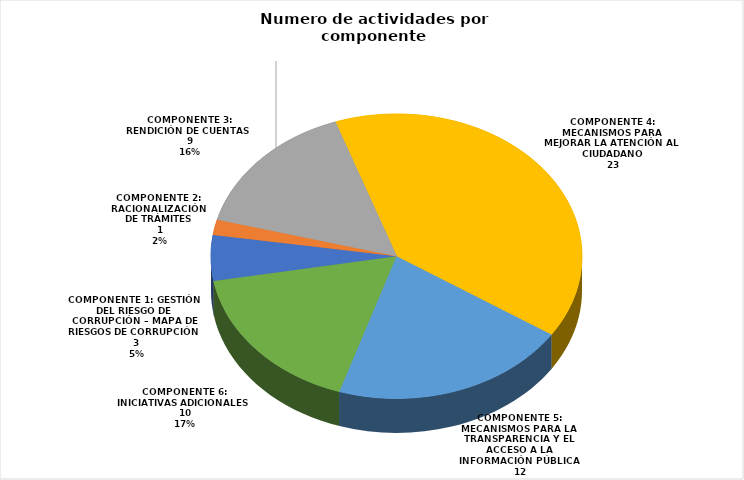
| Category | Cantidad de Actividades |
|---|---|
| COMPONENTE 1: GESTIÓN DEL RIESGO DE CORRUPCIÓN – MAPA DE RIESGOS DE CORRUPCIÓN | 3 |
| COMPONENTE 2: RACIONALIZACIÓN DE TRÁMITES | 1 |
| COMPONENTE 3: RENDICIÓN DE CUENTAS | 9 |
| COMPONENTE 4: MECANISMOS PARA MEJORAR LA ATENCIÓN AL CIUDADANO | 23 |
| COMPONENTE 5: MECANISMOS PARA LA TRANSPARENCIA Y EL ACCESO A LA INFORMACIÓN PÚBLICA | 12 |
| COMPONENTE 6: INICIATIVAS ADICIONALES | 10 |